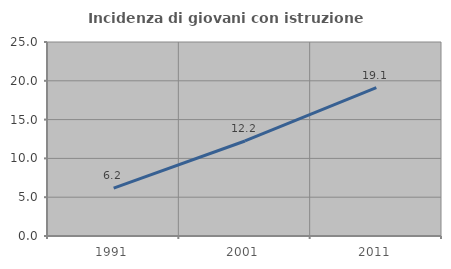
| Category | Incidenza di giovani con istruzione universitaria |
|---|---|
| 1991.0 | 6.173 |
| 2001.0 | 12.245 |
| 2011.0 | 19.118 |